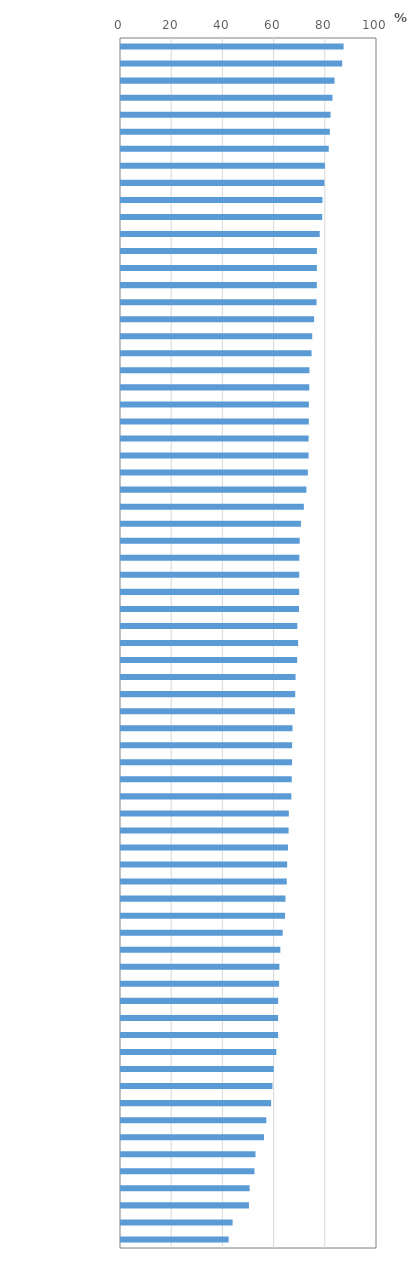
| Category | Percentage of satisfied students with life, by the following student characteristics |
|---|---|
| Kazakhstan | 86.948 |
| Albania | 86.41 |
| Belarus | 83.42 |
| Mexico | 82.614 |
| Kosovo | 81.869 |
| Ukraine | 81.584 |
| North Macedonia | 81.16 |
| Romania | 79.655 |
| Netherlands | 79.458 |
| Costa Rica | 78.699 |
| Dominican Republic | 78.613 |
| Finland | 77.63 |
| Moldova | 76.529 |
| Panama | 76.512 |
| Bosnia and Herzegovina | 76.5 |
| Croatia | 76.386 |
| Lithuania | 75.445 |
| Montenegro | 74.7 |
| Serbia | 74.442 |
| Georgia | 73.619 |
| Spain | 73.543 |
| Switzerland | 73.379 |
| Uruguay | 73.363 |
| Viet Nam | 73.29 |
| Thailand | 73.275 |
| Colombia | 72.981 |
| Iceland | 72.415 |
| Saudi Arabia | 71.436 |
| Indonesia | 70.295 |
| Estonia | 69.813 |
| Argentina | 69.677 |
| France | 69.639 |
| Austria | 69.598 |
| Slovak Republic | 69.53 |
| Portugal | 68.884 |
| Russia | 69.184 |
| Latvia | 68.813 |
| Luxembourg | 68.195 |
| Peru | 68.059 |
| Hungary | 67.915 |
| Italy | 67.014 |
| OECD average | 66.858 |
| Baku (Azerbaijan) | 66.829 |
| Sweden | 66.705 |
| Germany | 66.541 |
| Philippines | 65.549 |
| Greece | 65.479 |
| Bulgaria | 65.237 |
| Brazil | 64.912 |
| Czech Republic | 64.753 |
| Chile | 64.251 |
| Slovenia | 64.06 |
| Malaysia | 63.165 |
| Morocco | 62.239 |
| Poland | 61.878 |
| Jordan | 61.758 |
| United Arab Emirates | 61.384 |
| Ireland | 61.38 |
| Qatar | 61.369 |
| United States | 60.679 |
| Malta | 59.691 |
| B-S-J-Z (China) | 59.152 |
| Lebanon | 58.65 |
| Korea | 56.743 |
| Chinese Taipei | 55.849 |
| United Kingdom | 52.537 |
| Hong Kong (China) | 52.134 |
| Japan | 50.247 |
| Macao (China) | 49.984 |
| Turkey | 43.609 |
| Brunei Darussalam | 42.037 |